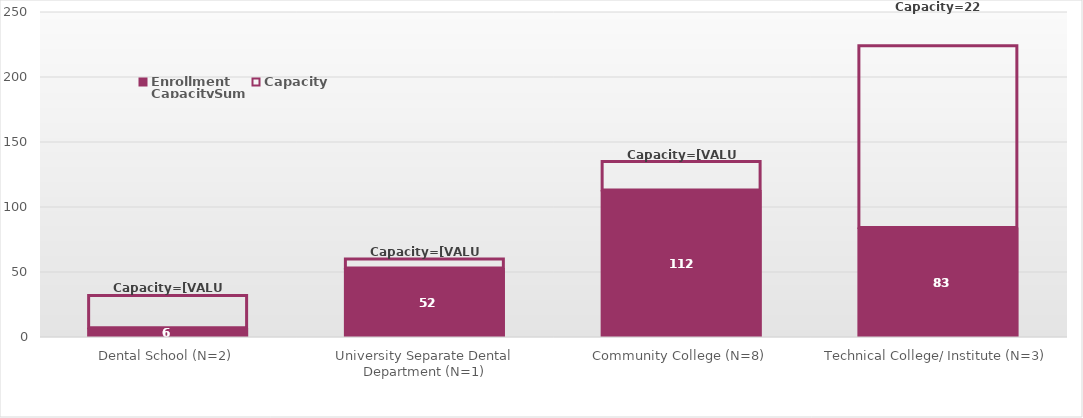
| Category | Enrollment | Capacity  | CapacitySum |
|---|---|---|---|
| Dental School (N=2) | 6 | 26 | 32 |
| University Separate Dental Department (N=1) | 52 | 8 | 60 |
| Community College (N=8) | 112 | 23 | 135 |
| Technical College/ Institute (N=3) | 83 | 141 | 224 |